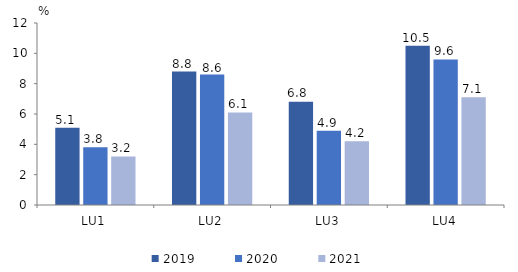
| Category | 2019 | 2020 | 2021 |
|---|---|---|---|
| LU1 | 5.1 | 3.8 | 3.2 |
| LU2 | 8.8 | 8.6 | 6.1 |
| LU3 | 6.8 | 4.9 | 4.2 |
| LU4 | 10.5 | 9.6 | 7.1 |